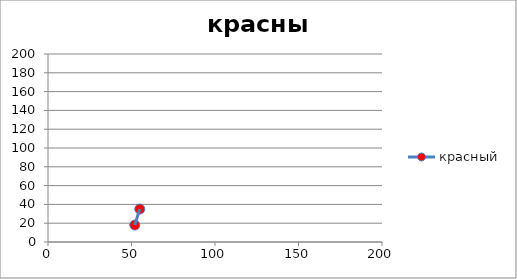
| Category | красный |
|---|---|
| 51.95 | 18.05 |